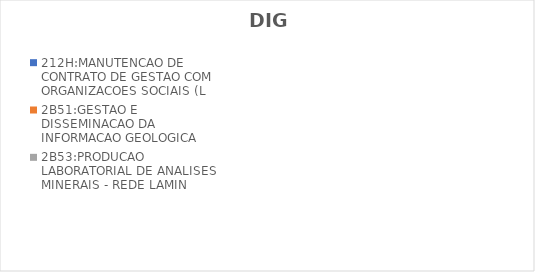
| Category | 212H:MANUTENCAO DE CONTRATO DE GESTAO COM ORGANIZACOES SOCIAIS (L | 2B51:GESTAO E DISSEMINACAO DA INFORMACAO GEOLOGICA | 2B53:PRODUCAO LABORATORIAL DE ANALISES MINERAIS - REDE LAMIN |
|---|---|---|---|
| EXECUTADO | 0 | 0.725 | 0.348 |